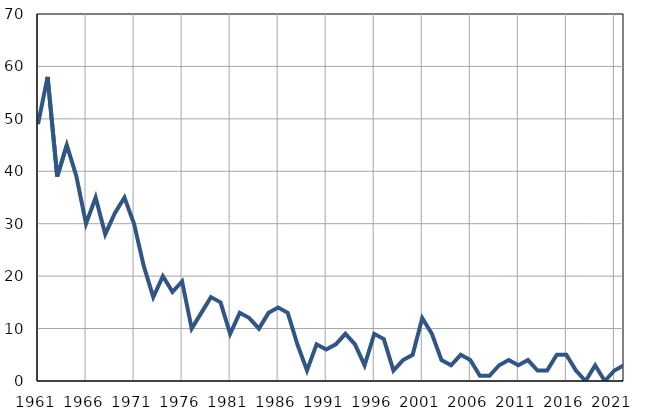
| Category | Infants
deaths |
|---|---|
| 1961.0 | 49 |
| 1962.0 | 58 |
| 1963.0 | 39 |
| 1964.0 | 45 |
| 1965.0 | 39 |
| 1966.0 | 30 |
| 1967.0 | 35 |
| 1968.0 | 28 |
| 1969.0 | 32 |
| 1970.0 | 35 |
| 1971.0 | 30 |
| 1972.0 | 22 |
| 1973.0 | 16 |
| 1974.0 | 20 |
| 1975.0 | 17 |
| 1976.0 | 19 |
| 1977.0 | 10 |
| 1978.0 | 13 |
| 1979.0 | 16 |
| 1980.0 | 15 |
| 1981.0 | 9 |
| 1982.0 | 13 |
| 1983.0 | 12 |
| 1984.0 | 10 |
| 1985.0 | 13 |
| 1986.0 | 14 |
| 1987.0 | 13 |
| 1988.0 | 7 |
| 1989.0 | 2 |
| 1990.0 | 7 |
| 1991.0 | 6 |
| 1992.0 | 7 |
| 1993.0 | 9 |
| 1994.0 | 7 |
| 1995.0 | 3 |
| 1996.0 | 9 |
| 1997.0 | 8 |
| 1998.0 | 2 |
| 1999.0 | 4 |
| 2000.0 | 5 |
| 2001.0 | 12 |
| 2002.0 | 9 |
| 2003.0 | 4 |
| 2004.0 | 3 |
| 2005.0 | 5 |
| 2006.0 | 4 |
| 2007.0 | 1 |
| 2008.0 | 1 |
| 2009.0 | 3 |
| 2010.0 | 4 |
| 2011.0 | 3 |
| 2012.0 | 4 |
| 2013.0 | 2 |
| 2014.0 | 2 |
| 2015.0 | 5 |
| 2016.0 | 5 |
| 2017.0 | 2 |
| 2018.0 | 0 |
| 2019.0 | 3 |
| 2020.0 | 0 |
| 2021.0 | 2 |
| 2022.0 | 3 |